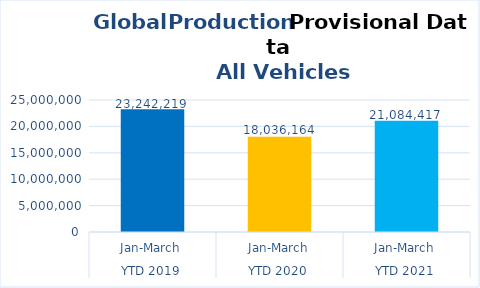
| Category | Series 0 |
|---|---|
| 0 | 23242218.868 |
| 1 | 18036164 |
| 2 | 21084416.54 |